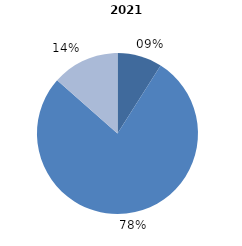
| Category | 2021 |
|---|---|
| cercetare fundamentală | 9 |
| cercetare aplicativă | 77.5 |
| dezvoltare tehnologică  | 13.5 |